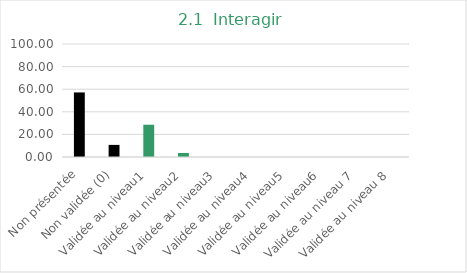
| Category | Series 0 |
|---|---|
| Non présentée | 57.143 |
| Non validée (0) | 10.714 |
| Validée au niveau1 | 28.571 |
| Validée au niveau2 | 3.571 |
| Validée au niveau3 | 0 |
| Validée au niveau4 | 0 |
| Validée au niveau5 | 0 |
| Validée au niveau6 | 0 |
| Validée au niveau 7 | 0 |
| Validée au niveau 8 | 0 |